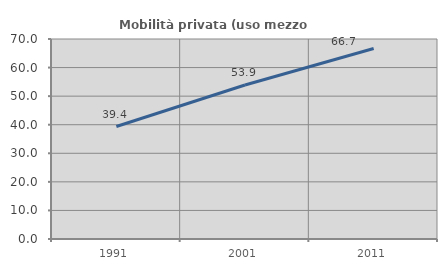
| Category | Mobilità privata (uso mezzo privato) |
|---|---|
| 1991.0 | 39.374 |
| 2001.0 | 53.909 |
| 2011.0 | 66.667 |